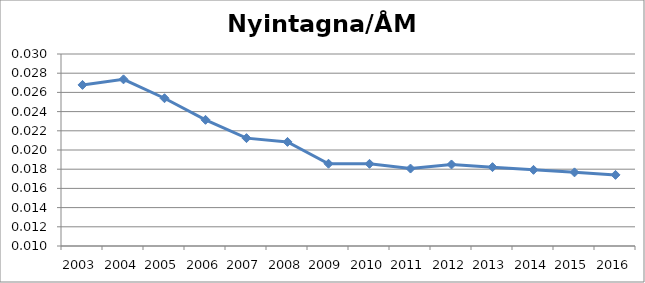
| Category | Nyintagna/ÅM in |
|---|---|
| 2003.0 | 0.027 |
| 2004.0 | 0.027 |
| 2005.0 | 0.025 |
| 2006.0 | 0.023 |
| 2007.0 | 0.021 |
| 2008.0 | 0.021 |
| 2009.0 | 0.019 |
| 2010.0 | 0.019 |
| 2011.0 | 0.018 |
| 2012.0 | 0.018 |
| 2013.0 | 0.018 |
| 2014.0 | 0.018 |
| 2015.0 | 0.018 |
| 2016.0 | 0.017 |